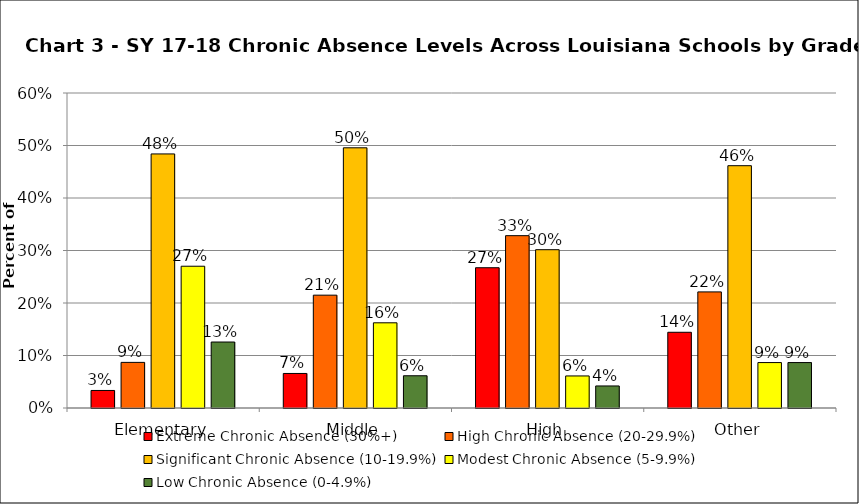
| Category | Extreme Chronic Absence (30%+) | High Chronic Absence (20-29.9%) | Significant Chronic Absence (10-19.9%) | Modest Chronic Absence (5-9.9%) | Low Chronic Absence (0-4.9%) |
|---|---|---|---|---|---|
| 0 | 0.033 | 0.087 | 0.484 | 0.27 | 0.126 |
| 1 | 0.066 | 0.215 | 0.496 | 0.162 | 0.061 |
| 2 | 0.267 | 0.328 | 0.302 | 0.061 | 0.042 |
| 3 | 0.144 | 0.221 | 0.462 | 0.087 | 0.087 |